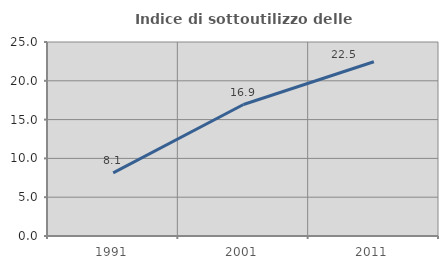
| Category | Indice di sottoutilizzo delle abitazioni  |
|---|---|
| 1991.0 | 8.129 |
| 2001.0 | 16.942 |
| 2011.0 | 22.453 |